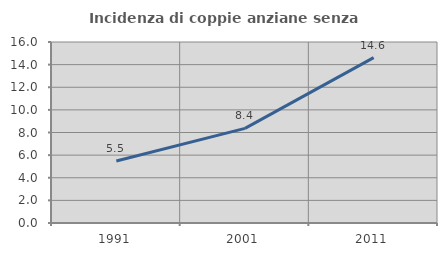
| Category | Incidenza di coppie anziane senza figli  |
|---|---|
| 1991.0 | 5.482 |
| 2001.0 | 8.368 |
| 2011.0 | 14.619 |